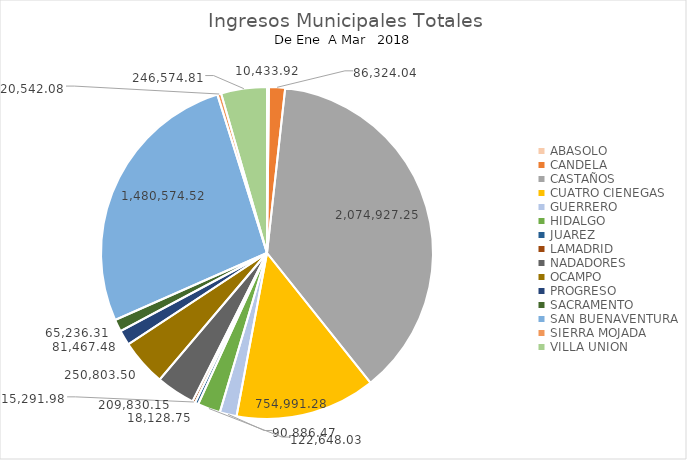
| Category | Series 0 |
|---|---|
| ABASOLO | 10433.92 |
| CANDELA | 86324.04 |
| CASTAÑOS | 2074927.25 |
| CUATRO CIENEGAS | 754991.28 |
| GUERRERO | 90886.47 |
| HIDALGO | 122648.03 |
| JUAREZ | 18128.75 |
| LAMADRID | 15291.98 |
| NADADORES | 209830.15 |
| OCAMPO | 250803.5 |
| PROGRESO | 81467.48 |
| SACRAMENTO | 65236.31 |
| SAN BUENAVENTURA | 1480574.52 |
| SIERRA MOJADA | 20542.08 |
| VILLA UNION | 246574.81 |